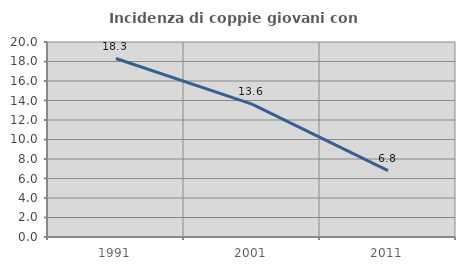
| Category | Incidenza di coppie giovani con figli |
|---|---|
| 1991.0 | 18.306 |
| 2001.0 | 13.629 |
| 2011.0 | 6.81 |